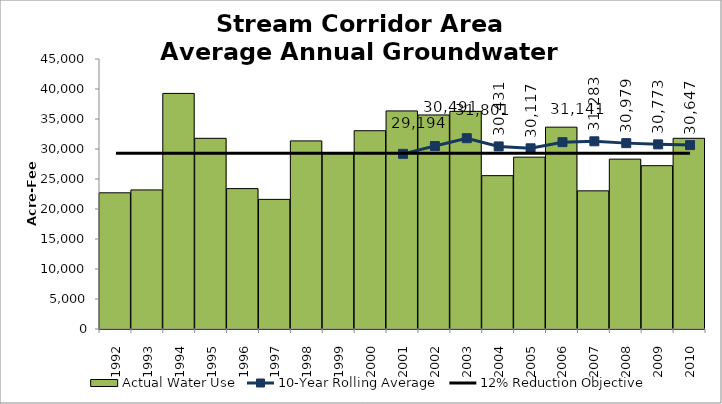
| Category | Actual Water Use |
|---|---|
| 1992.0 | 22699.7 |
| 1993.0 | 23177.85 |
| 1994.0 | 39265.45 |
| 1995.0 | 31779.51 |
| 1996.0 | 23397.51 |
| 1997.0 | 21604 |
| 1998.0 | 31350 |
| 1999.0 | 29277 |
| 2000.0 | 33046.56 |
| 2001.0 | 36344.55 |
| 2002.0 | 35672.27 |
| 2003.0 | 36275.11 |
| 2004.0 | 25559.22 |
| 2005.0 | 28641.49 |
| 2006.0 | 33638.59 |
| 2007.0 | 23027.31 |
| 2008.0 | 28308.78 |
| 2009.0 | 27218.35 |
| 2010.0 | 31783.2 |